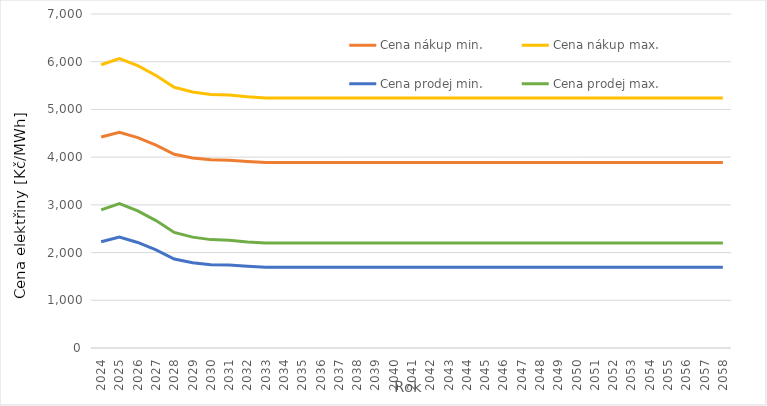
| Category | Cena nákup min. | Cena nákup max. | Cena prodej min. | Cena prodej max. |
|---|---|---|---|---|
| 2024.0 | 4422.439 | 5935.681 | 2226.139 | 2893.981 |
| 2025.0 | 4522.926 | 6066.314 | 2326.626 | 3024.614 |
| 2026.0 | 4408.045 | 5916.969 | 2211.745 | 2875.269 |
| 2027.0 | 4250.62 | 5712.316 | 2054.32 | 2670.616 |
| 2028.0 | 4059.749 | 5464.184 | 1863.449 | 2422.484 |
| 2029.0 | 3983.856 | 5365.523 | 1787.556 | 2323.823 |
| 2030.0 | 3943.593 | 5313.181 | 1747.293 | 2271.481 |
| 2031.0 | 3934.079 | 5300.812 | 1737.779 | 2259.112 |
| 2032.0 | 3907.106 | 5265.747 | 1710.806 | 2224.047 |
| 2033.0 | 3887.489 | 5240.246 | 1691.189 | 2198.546 |
| 2034.0 | 3887.489 | 5240.246 | 1691.189 | 2198.546 |
| 2035.0 | 3887.489 | 5240.246 | 1691.189 | 2198.546 |
| 2036.0 | 3887.489 | 5240.246 | 1691.189 | 2198.546 |
| 2037.0 | 3887.489 | 5240.246 | 1691.189 | 2198.546 |
| 2038.0 | 3887.489 | 5240.246 | 1691.189 | 2198.546 |
| 2039.0 | 3887.489 | 5240.246 | 1691.189 | 2198.546 |
| 2040.0 | 3887.489 | 5240.246 | 1691.189 | 2198.546 |
| 2041.0 | 3887.489 | 5240.246 | 1691.189 | 2198.546 |
| 2042.0 | 3887.489 | 5240.246 | 1691.189 | 2198.546 |
| 2043.0 | 3887.489 | 5240.246 | 1691.189 | 2198.546 |
| 2044.0 | 3887.489 | 5240.246 | 1691.189 | 2198.546 |
| 2045.0 | 3887.489 | 5240.246 | 1691.189 | 2198.546 |
| 2046.0 | 3887.489 | 5240.246 | 1691.189 | 2198.546 |
| 2047.0 | 3887.489 | 5240.246 | 1691.189 | 2198.546 |
| 2048.0 | 3887.489 | 5240.246 | 1691.189 | 2198.546 |
| 2049.0 | 3887.489 | 5240.246 | 1691.189 | 2198.546 |
| 2050.0 | 3887.489 | 5240.246 | 1691.189 | 2198.546 |
| 2051.0 | 3887.489 | 5240.246 | 1691.189 | 2198.546 |
| 2052.0 | 3887.489 | 5240.246 | 1691.189 | 2198.546 |
| 2053.0 | 3887.489 | 5240.246 | 1691.189 | 2198.546 |
| 2054.0 | 3887.489 | 5240.246 | 1691.189 | 2198.546 |
| 2055.0 | 3887.489 | 5240.246 | 1691.189 | 2198.546 |
| 2056.0 | 3887.489 | 5240.246 | 1691.189 | 2198.546 |
| 2057.0 | 3887.489 | 5240.246 | 1691.189 | 2198.546 |
| 2058.0 | 3887.489 | 5240.246 | 1691.189 | 2198.546 |